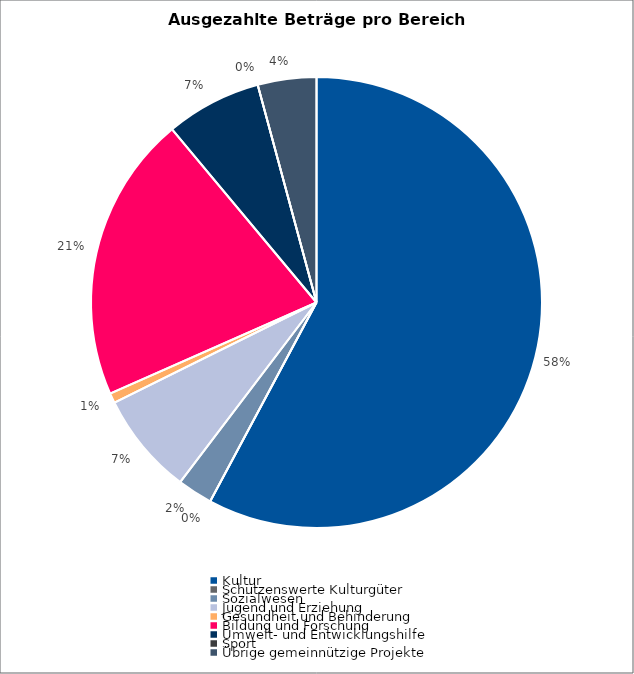
| Category | Series 0 |
|---|---|
| Kultur | 3025169.55 |
| Schützenswerte Kulturgüter | 0 |
| Sozialwesen | 131500 |
| Jugend und Erziehung | 384400 |
| Gesundheit und Behinderung | 37000 |
| Bildung und Forschung | 1075500 |
| Umwelt- und Entwicklungshilfe | 358830 |
| Sport | 0 |
| Übrige gemeinnützige Projekte | 220000 |